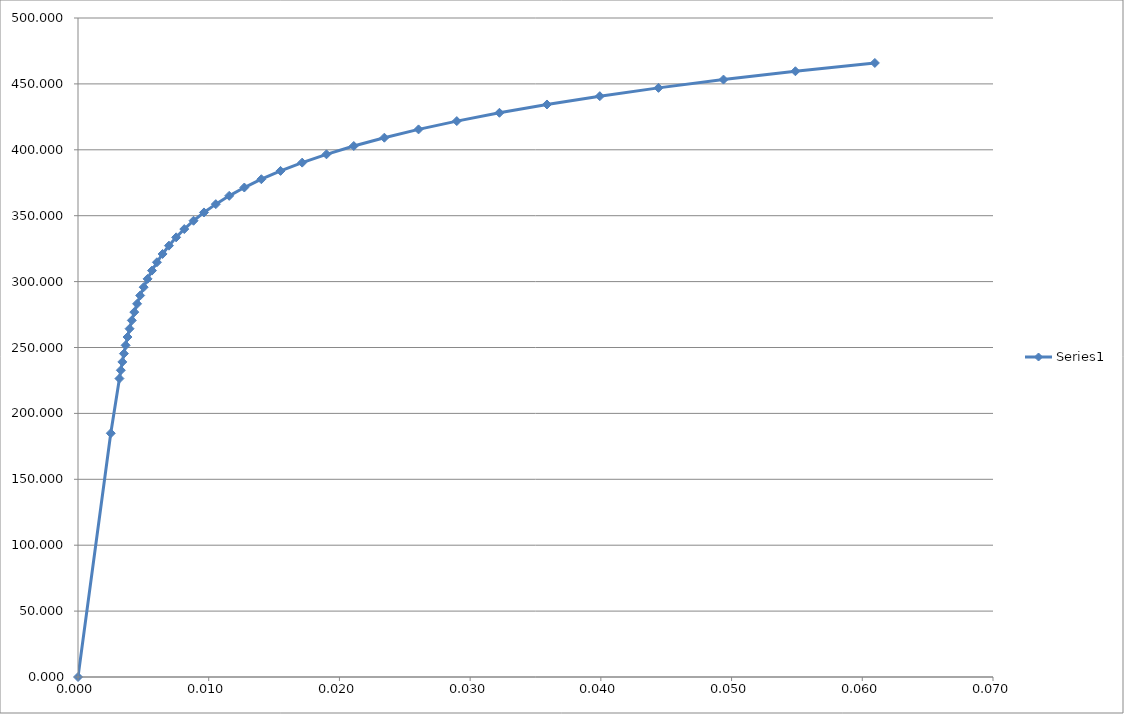
| Category | Series 0 |
|---|---|
| 0.0 | 0 |
| 0.00250672035527003 | 184.931 |
| 0.0031710064540753534 | 226.446 |
| 0.0032776548661284316 | 232.747 |
| 0.0033912512845181452 | 239.049 |
| 0.0035131012725755583 | 245.35 |
| 0.00364471623776113 | 251.651 |
| 0.0037878399363447915 | 257.952 |
| 0.003944477637036107 | 264.253 |
| 0.004116928128806711 | 270.554 |
| 0.00430781876213751 | 276.855 |
| 0.0045201437155070676 | 283.157 |
| 0.00475730567966518 | 289.458 |
| 0.005023161150697628 | 295.759 |
| 0.005322069518497552 | 302.06 |
| 0.005658946129394686 | 308.361 |
| 0.0060393194896081635 | 314.662 |
| 0.0064693927589895206 | 320.963 |
| 0.006956109661251184 | 327.265 |
| 0.007507224906348057 | 333.566 |
| 0.008131379181654024 | 339.867 |
| 0.00883817871957805 | 346.168 |
| 0.009638279388732116 | 352.469 |
| 0.010543475181959765 | 358.77 |
| 0.011566790885600439 | 365.072 |
| 0.012722578608374441 | 371.373 |
| 0.01402661772324072 | 377.674 |
| 0.015496217629542381 | 383.975 |
| 0.017150322573918235 | 390.276 |
| 0.019009617575230793 | 396.577 |
| 0.021096634280031105 | 402.878 |
| 0.02343585533031581 | 409.18 |
| 0.026053815554931557 | 415.481 |
| 0.028979198001488453 | 421.782 |
| 0.032242922510157264 | 428.083 |
| 0.03587822419922383 | 434.384 |
| 0.039920718892084 | 440.685 |
| 0.04440845217650538 | 446.986 |
| 0.04938192846258993 | 453.288 |
| 0.05488411611252523 | 459.589 |
| 0.06096042447299606 | 465.89 |